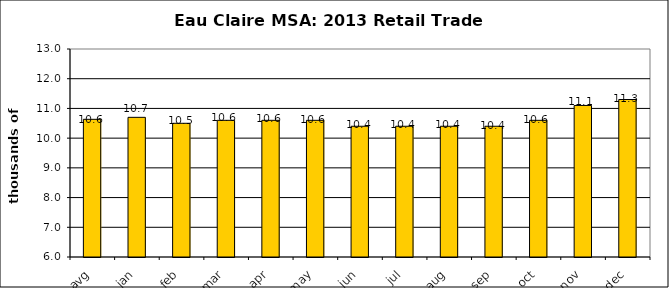
| Category | 2014 |
|---|---|
| ytd_avg | 10.633 |
| jan | 10.7 |
| feb | 10.5 |
| mar | 10.6 |
| apr | 10.6 |
| may | 10.6 |
| jun | 10.4 |
| jul | 10.4 |
| aug | 10.4 |
| sep | 10.4 |
| oct | 10.6 |
| nov | 11.1 |
| dec | 11.3 |